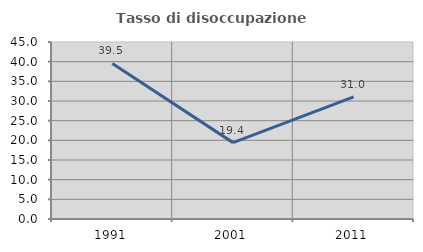
| Category | Tasso di disoccupazione giovanile  |
|---|---|
| 1991.0 | 39.535 |
| 2001.0 | 19.417 |
| 2011.0 | 31.034 |